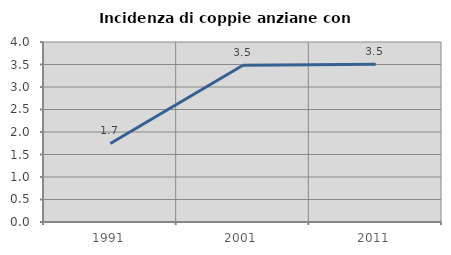
| Category | Incidenza di coppie anziane con figli |
|---|---|
| 1991.0 | 1.746 |
| 2001.0 | 3.484 |
| 2011.0 | 3.504 |